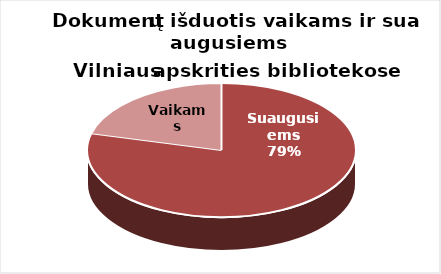
| Category | Series 0 |
|---|---|
| Suaugusiems | 1250107 |
| Vaikams | 331232 |